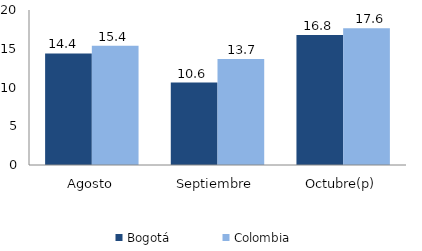
| Category | Bogotá | Colombia |
|---|---|---|
| Agosto | 14.402 | 15.38 |
| Septiembre | 10.633 | 13.674 |
| Octubre(p) | 16.778 | 17.64 |